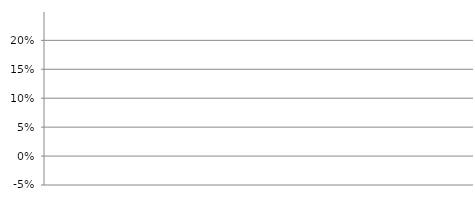
| Category | Kapitaldienstanteil (Kapitaldienst / Laufender Ertrag) |
|---|---|
| 2018.0 | 0 |
| 2019.0 | 0 |
| 2020.0 | 0 |
| 2021.0 | 0 |
| 2022.0 | 0 |